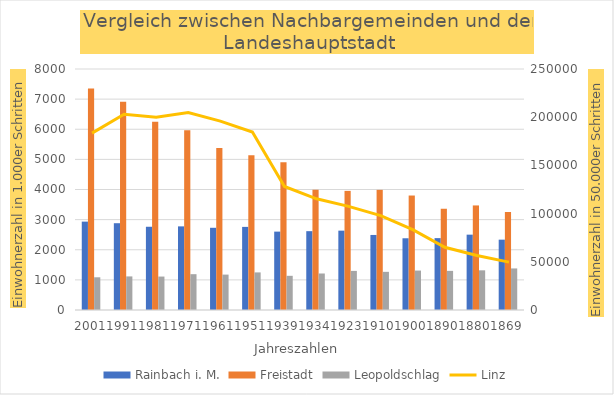
| Category | Rainbach i. M. | Freistadt | Leopoldschlag |
|---|---|---|---|
| 2001 | 2934 | 7353 | 1086 |
| 1991 | 2881 | 6917 | 1115 |
| 1981 | 2763 | 6251 | 1110 |
| 1971 | 2776 | 5963 | 1189 |
| 1961 | 2729 | 5375 | 1175 |
| 1951 | 2759 | 5136 | 1248 |
| 1939 | 2602 | 4903 | 1135 |
| 1934 | 2617 | 3992 | 1212 |
| 1923 | 2634 | 3954 | 1298 |
| 1910 | 2491 | 3988 | 1267 |
| 1900 | 2381 | 3800 | 1309 |
| 1890 | 2386 | 3361 | 1299 |
| 1880 | 2501 | 3471 | 1317 |
| 1869 | 2335 | 3253 | 1380 |